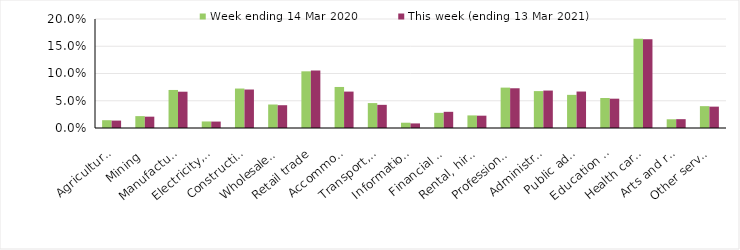
| Category | Week ending 14 Mar 2020 | This week (ending 13 Mar 2021) |
|---|---|---|
| Agriculture, forestry and fishing | 0.014 | 0.014 |
| Mining | 0.022 | 0.021 |
| Manufacturing | 0.07 | 0.067 |
| Electricity, gas, water and waste services | 0.012 | 0.012 |
| Construction | 0.072 | 0.071 |
| Wholesale trade | 0.043 | 0.042 |
| Retail trade | 0.104 | 0.106 |
| Accommodation and food services | 0.075 | 0.067 |
| Transport, postal and warehousing | 0.046 | 0.042 |
| Information media and telecommunications | 0.01 | 0.008 |
| Financial and insurance services | 0.028 | 0.03 |
| Rental, hiring and real estate services | 0.023 | 0.023 |
| Professional, scientific and technical services | 0.074 | 0.073 |
| Administrative and support services | 0.068 | 0.069 |
| Public administration and safety | 0.061 | 0.067 |
| Education and training | 0.055 | 0.054 |
| Health care and social assistance | 0.164 | 0.163 |
| Arts and recreation services | 0.016 | 0.016 |
| Other services | 0.04 | 0.039 |